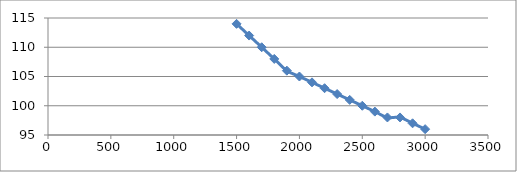
| Category | Series 0 |
|---|---|
| 1500.0 | 114 |
| 1600.0 | 112 |
| 1700.0 | 110 |
| 1800.0 | 108 |
| 1900.0 | 106 |
| 2000.0 | 105 |
| 2100.0 | 104 |
| 2200.0 | 103 |
| 2300.0 | 102 |
| 2400.0 | 101 |
| 2500.0 | 100 |
| 2600.0 | 99 |
| 2700.0 | 98 |
| 2800.0 | 98 |
| 2900.0 | 97 |
| 3000.0 | 96 |